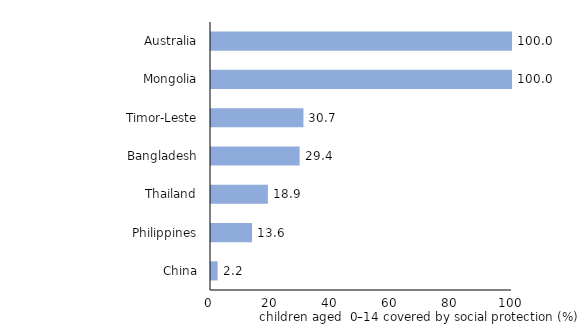
| Category | Children covered by SP, % of children 0-14 |
|---|---|
| China | 2.208 |
| Philippines | 13.645 |
| Thailand | 18.9 |
| Bangladesh | 29.44 |
| Timor-Leste | 30.714 |
| Mongolia | 100 |
| Australia | 100 |